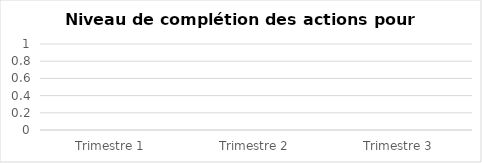
| Category | 0% | 10% | 15% | 25% | 50% | 75% | 90% | 100% |
|---|---|---|---|---|---|---|---|---|
| Trimestre 1 | 0 | 0 | 0 | 0 | 0 | 0 | 0 | 0 |
| Trimestre 2 | 0 | 0 | 0 | 0 | 0 | 0 | 0 | 0 |
| Trimestre 3 | 0 | 0 | 0 | 0 | 0 | 0 | 0 | 0 |